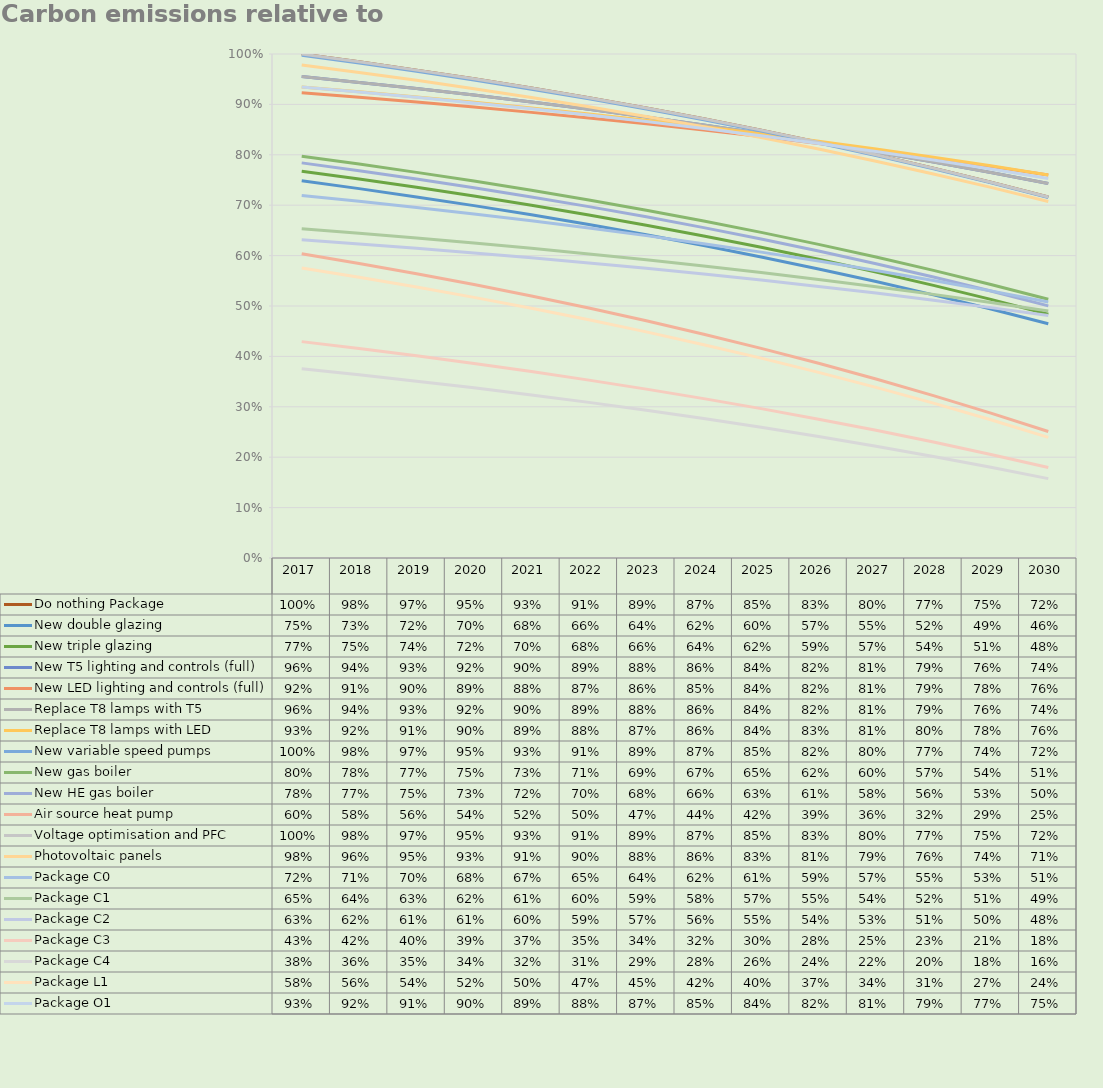
| Category | Do nothing Package | Insulated wall | Insulated roof | Improved air tightness | New LED lighting and controls (full) | Higher efficiency boiler | Refurbished fan coil units | New air cooled chiller | Voltage optimisation and PFC | Photovoltaic panels | Package C1 | Package C2 | Package C3 | Package C4 | Package C5 | New double glazing | New triple glazing | New T5 lighting and controls (full) | Replace T8 lamps with T5 | Replace T8 lamps with LED  | New variable speed pumps | New gas boiler | New HE gas boiler | Air source heat pump | Package C0 | Package L1 | Package O1 | LED rather than T5 lights and controls | LED rather than T5 lamps | ASHP rather than gas boiler | Package L2 | New AHU | New high efficiency AHU | Package L3 | Higher efficiency AHU | Insulated Ground Floor | Package C6 | Package C7 |
|---|---|---|---|---|---|---|---|---|---|---|---|---|---|---|---|---|---|---|---|---|---|---|---|---|---|---|---|---|---|---|---|---|---|---|---|---|---|---|
| 2017 |  |  |  |  |  |  |  |  |  |  |  |  |  |  |  |  |  |  |  |  |  |  |  |  |  |  |  |  |  |  |  |  |  |  |  |  |  |  |
| 2018 |  |  |  |  |  |  |  |  |  |  |  |  |  |  |  |  |  |  |  |  |  |  |  |  |  |  |  |  |  |  |  |  |  |  |  |  |  |  |
| 2019 |  |  |  |  |  |  |  |  |  |  |  |  |  |  |  |  |  |  |  |  |  |  |  |  |  |  |  |  |  |  |  |  |  |  |  |  |  |  |
| 2020 |  |  |  |  |  |  |  |  |  |  |  |  |  |  |  |  |  |  |  |  |  |  |  |  |  |  |  |  |  |  |  |  |  |  |  |  |  |  |
| 2021 |  |  |  |  |  |  |  |  |  |  |  |  |  |  |  |  |  |  |  |  |  |  |  |  |  |  |  |  |  |  |  |  |  |  |  |  |  |  |
| 2022 |  |  |  |  |  |  |  |  |  |  |  |  |  |  |  |  |  |  |  |  |  |  |  |  |  |  |  |  |  |  |  |  |  |  |  |  |  |  |
| 2023 |  |  |  |  |  |  |  |  |  |  |  |  |  |  |  |  |  |  |  |  |  |  |  |  |  |  |  |  |  |  |  |  |  |  |  |  |  |  |
| 2024 |  |  |  |  |  |  |  |  |  |  |  |  |  |  |  |  |  |  |  |  |  |  |  |  |  |  |  |  |  |  |  |  |  |  |  |  |  |  |
| 2025 |  |  |  |  |  |  |  |  |  |  |  |  |  |  |  |  |  |  |  |  |  |  |  |  |  |  |  |  |  |  |  |  |  |  |  |  |  |  |
| 2026 |  |  |  |  |  |  |  |  |  |  |  |  |  |  |  |  |  |  |  |  |  |  |  |  |  |  |  |  |  |  |  |  |  |  |  |  |  |  |
| 2027 |  |  |  |  |  |  |  |  |  |  |  |  |  |  |  |  |  |  |  |  |  |  |  |  |  |  |  |  |  |  |  |  |  |  |  |  |  |  |
| 2028 |  |  |  |  |  |  |  |  |  |  |  |  |  |  |  |  |  |  |  |  |  |  |  |  |  |  |  |  |  |  |  |  |  |  |  |  |  |  |
| 2029 |  |  |  |  |  |  |  |  |  |  |  |  |  |  |  |  |  |  |  |  |  |  |  |  |  |  |  |  |  |  |  |  |  |  |  |  |  |  |
| 2030 |  |  |  |  |  |  |  |  |  |  |  |  |  |  |  |  |  |  |  |  |  |  |  |  |  |  |  |  |  |  |  |  |  |  |  |  |  |  |
| 2031 |  |  |  |  |  |  |  |  |  |  |  |  |  |  |  |  |  |  |  |  |  |  |  |  |  |  |  |  |  |  |  |  |  |  |  |  |  |  |